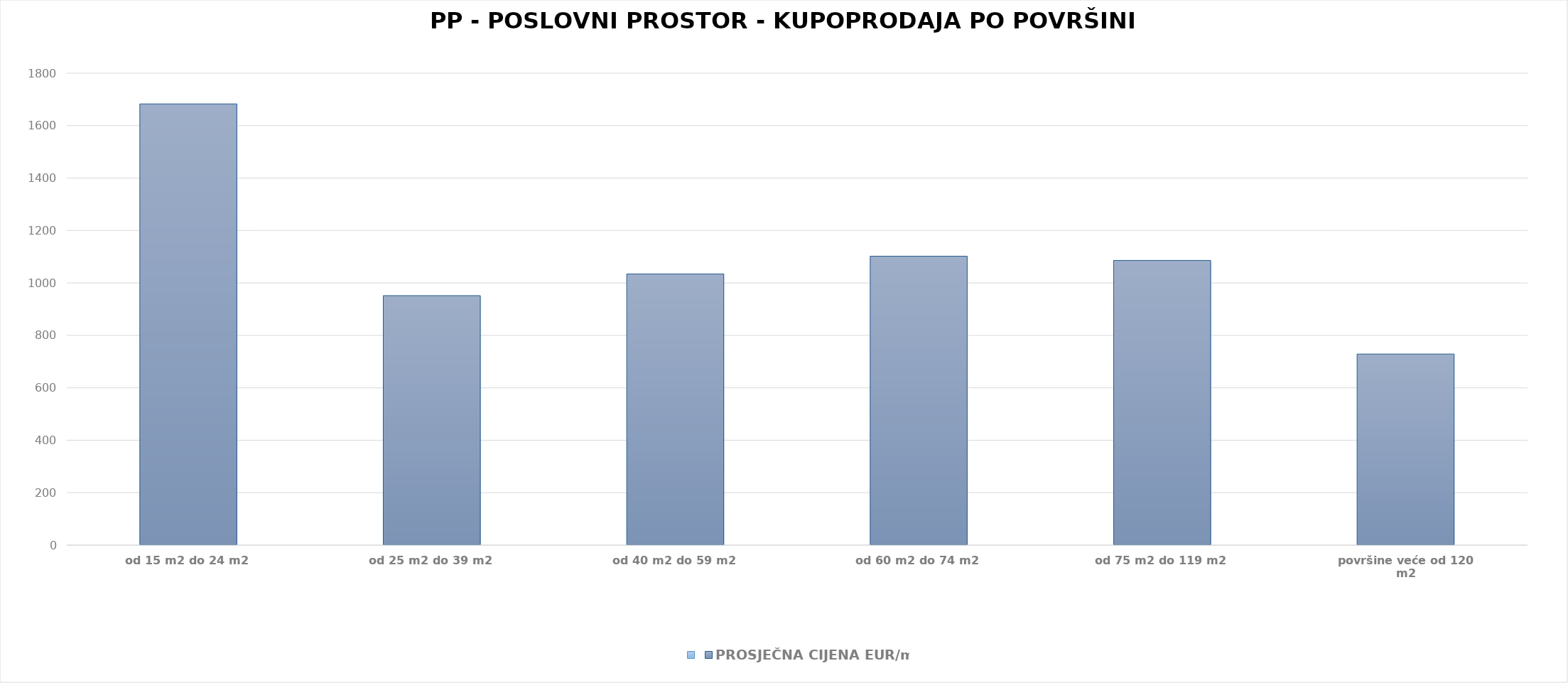
| Category | Series 0 | PROSJEČNA CIJENA EUR/m2 |
|---|---|---|
| od 15 m2 do 24 m2 |  | 1904-08-08 20:57:15 |
| od 25 m2 do 39 m2 |  | 1902-08-08 14:26:23 |
| od 40 m2 do 59 m2 |  | 1902-10-30 07:36:38 |
| od 60 m2 do 74 m2 |  | 1903-01-06 01:04:50 |
| od 75 m2 do 119 m2 |  | 1902-12-20 21:22:27 |
| površine veće od 120 m2 |  | 1901-12-28 19:19:01 |